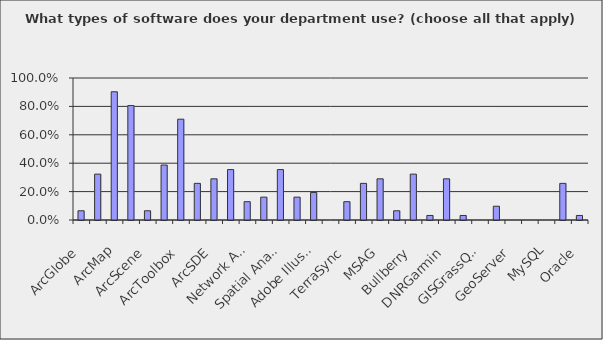
| Category | Series 0 |
|---|---|
| ArcGlobe | 0.065 |
| ArcReader | 0.323 |
| ArcMap | 0.903 |
| ArcCatalog | 0.806 |
| ArcScene | 0.065 |
| ArcGIS Explorer | 0.387 |
| ArcToolbox | 0.71 |
| Modelbuilder | 0.258 |
| ArcSDE | 0.29 |
| ArcServer | 0.355 |
| Network Analyst | 0.129 |
| 3D Analyst | 0.161 |
| Spatial Analyst | 0.355 |
| Crystal Reports | 0.161 |
| Adobe Illustrator | 0.194 |
| ERDAS Imagine | 0 |
| TerraSync | 0.129 |
| AutoCAD | 0.258 |
| MSAG | 0.29 |
| New World | 0.065 |
| Bullberry | 0.323 |
| Mapsource | 0.032 |
| DNRGarmin | 0.29 |
| Mapwindow | 0.032 |
| GISGrassQuantum | 0 |
| GISMapServer | 0.097 |
| GeoServer | 0 |
| PostgreSQL | 0 |
| MySQL | 0 |
| MSSQL Server | 0.258 |
| Oracle | 0.032 |